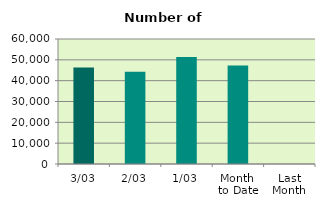
| Category | Series 0 |
|---|---|
| 3/03 | 46262 |
| 2/03 | 44310 |
| 1/03 | 51362 |
| Month 
to Date | 47311.333 |
| Last
Month | 0 |